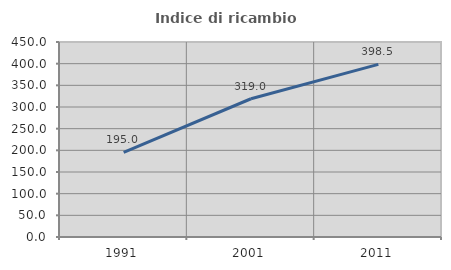
| Category | Indice di ricambio occupazionale  |
|---|---|
| 1991.0 | 195.045 |
| 2001.0 | 319.048 |
| 2011.0 | 398.485 |